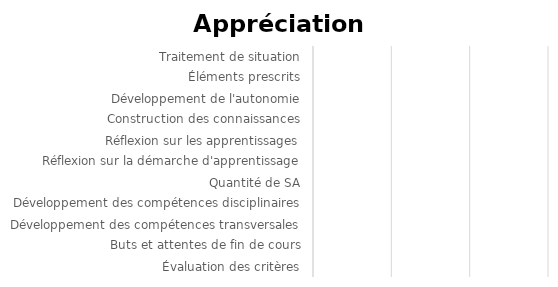
| Category | Series 0 |
|---|---|
| Traitement de situation | 0 |
| Éléments prescrits | 0 |
| Développement de l'autonomie | 0 |
| Construction des connaissances | 0 |
| Réflexion sur les apprentissages | 0 |
| Réflexion sur la démarche d'apprentissage | 0 |
| Quantité de SA | 0 |
| Développement des compétences disciplinaires | 0 |
| Développement des compétences transversales | 0 |
| Buts et attentes de fin de cours | 0 |
| Évaluation des critères | 0 |